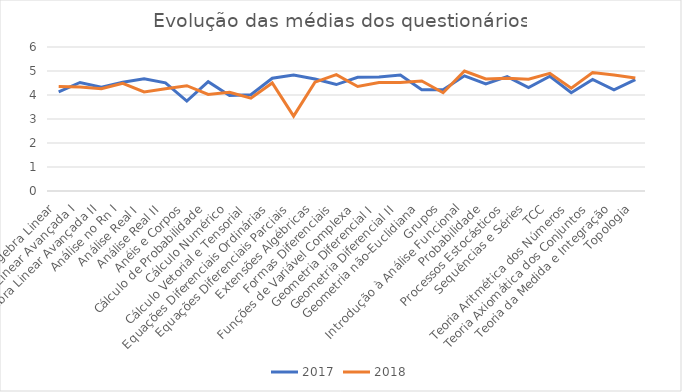
| Category | 2017 | 2018 |
|---|---|---|
| Álgebra Linear | 4.13 | 4.357 |
| Álgebra Linear Avançada I | 4.521 | 4.33 |
| Álgebra Linear Avançada II | 4.326 | 4.262 |
| Análise no Rn I | 4.528 | 4.489 |
| Análise Real I | 4.674 | 4.13 |
| Análise Real II | 4.505 | 4.262 |
| Anéis e Corpos | 3.746 | 4.389 |
| Cálculo de Probabilidade | 4.554 | 4.024 |
| Cálculo Numérico | 3.983 | 4.111 |
| Cálculo Vetorial e Tensorial | 4.01 | 3.868 |
| Equações Diferenciais Ordinárias | 4.7 | 4.503 |
| Equações Diferenciais Parciais | 4.833 | 3.12 |
| Extensões Algébricas | 4.667 | 4.533 |
| Formas Diferenciais | 4.435 | 4.85 |
| Funções de Variável Complexa | 4.736 | 4.354 |
| Geometria Diferencial I | 4.754 | 4.52 |
| Geometria Diferencial II | 4.834 | 4.525 |
| Geometria não-Euclidiana | 4.222 | 4.583 |
| Grupos | 4.223 | 4.093 |
| Introdução à Análise Funcional | 4.8 | 5 |
| Probabilidade | 4.462 | 4.669 |
| Processos Estocásticos | 4.766 | 4.7 |
| Sequências e Séries | 4.309 | 4.655 |
| TCC | 4.783 | 4.901 |
| Teoria Aritmética dos Números | 4.093 | 4.286 |
| Teoria Axiomática dos Conjuntos | 4.65 | 4.94 |
| Teoria da Medida e Integração | 4.211 | 4.835 |
| Topologia | 4.641 | 4.71 |